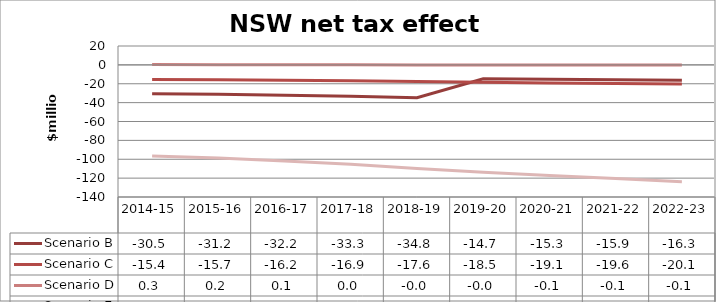
| Category | Scenario B | Scenario C | Scenario D | Scenario E |
|---|---|---|---|---|
| 2014-15 | -30.529 | -15.395 | 0.312 | -96.492 |
| 2015-16 | -31.18 | -15.718 | 0.202 | -98.637 |
| 2016-17 | -32.174 | -16.241 | 0.105 | -101.754 |
| 2017-18 | -33.316 | -16.859 | 0.05 | -105.224 |
| 2018-19 | -34.79 | -17.646 | -0.01 | -109.762 |
| 2019-20 | -14.694 | -18.506 | -0.045 | -113.84 |
| 2020-21 | -15.344 | -19.078 | -0.118 | -117.128 |
| 2021-22 | -15.854 | -19.618 | -0.095 | -120.513 |
| 2022-23 | -16.295 | -20.14 | -0.053 | -123.912 |